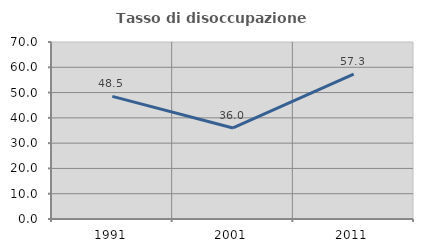
| Category | Tasso di disoccupazione giovanile  |
|---|---|
| 1991.0 | 48.485 |
| 2001.0 | 36 |
| 2011.0 | 57.333 |